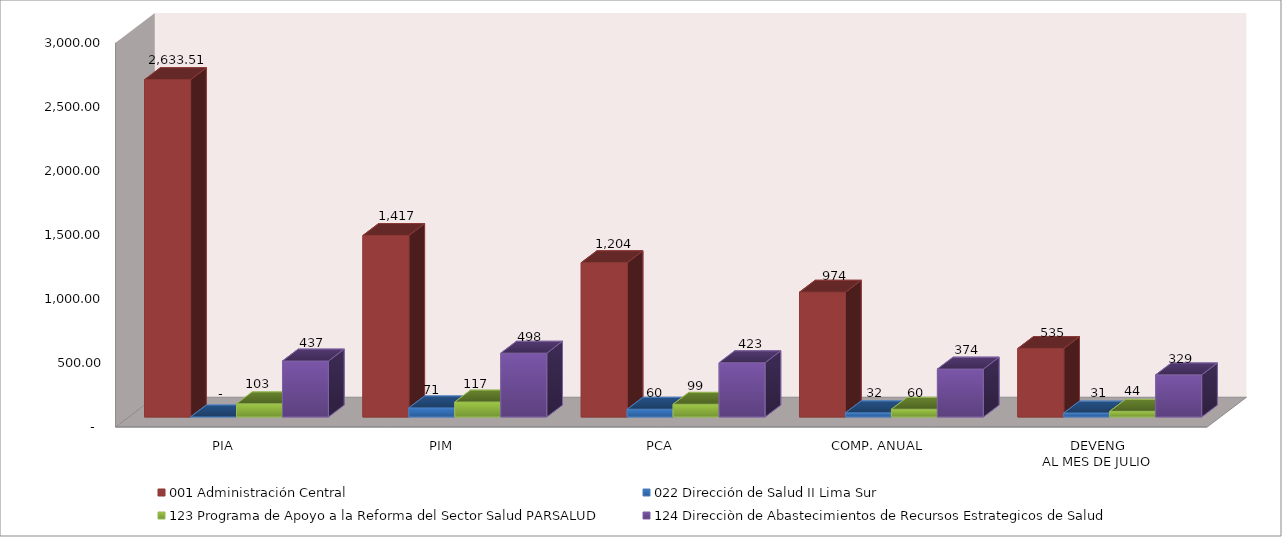
| Category | 001 Administración Central | 022 Dirección de Salud II Lima Sur | 123 Programa de Apoyo a la Reforma del Sector Salud PARSALUD | 124 Direcciòn de Abastecimientos de Recursos Estrategicos de Salud |
|---|---|---|---|---|
| PIA | 2633.509 | 0 | 102.766 | 436.8 |
| PIM | 1417.038 | 70.822 | 116.587 | 498.053 |
| PCA | 1204.482 | 60.199 | 99.099 | 423.345 |
| COMP. ANUAL | 974.277 | 32.291 | 60.179 | 373.936 |
| DEVENG
AL MES DE JULIO | 534.698 | 30.6 | 43.866 | 328.781 |